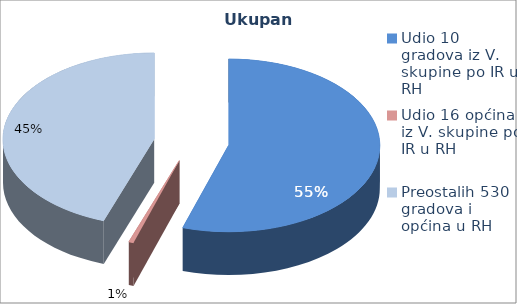
| Category | Ukupan prihod |
|---|---|
| Udio 10 gradova iz V. skupine po IR u RH | 0.549 |
| Udio 16 općina iz V. skupine po IR u RH | 0.005 |
| Preostalih 530 gradova i općina u RH | 0.446 |